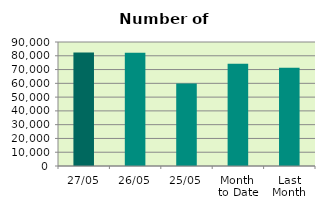
| Category | Series 0 |
|---|---|
| 27/05 | 82458 |
| 26/05 | 82118 |
| 25/05 | 59830 |
| Month 
to Date | 74274 |
| Last
Month | 71251.4 |